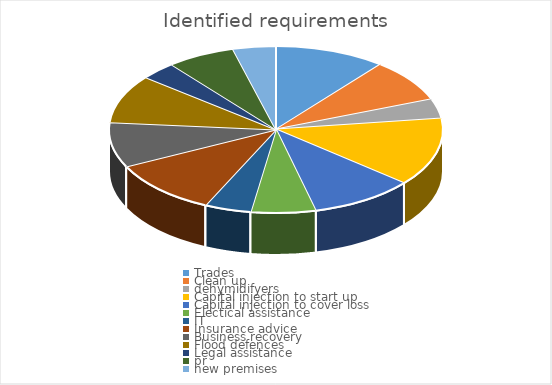
| Category | Series 0 |
|---|---|
| Trades | 31 |
| Clean up | 24 |
| dehymidifyers | 11 |
| Capital injection to start up  | 38 |
| Capital injection to cover loss  | 29 |
| Electical assistance  | 18 |
| IT  | 13 |
| Insurance advice | 31 |
| Business recovery | 25 |
| Flood defences  | 27 |
| Legal assistance | 10 |
| pr | 19 |
| new premises  | 12 |